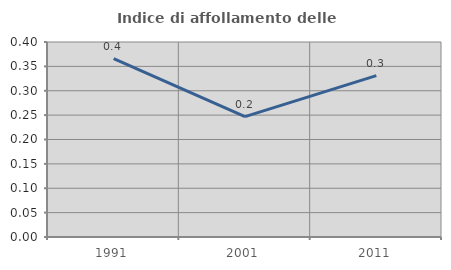
| Category | Indice di affollamento delle abitazioni  |
|---|---|
| 1991.0 | 0.366 |
| 2001.0 | 0.247 |
| 2011.0 | 0.331 |